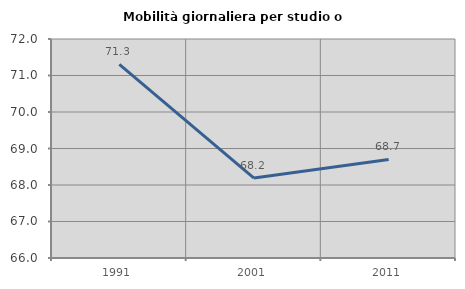
| Category | Mobilità giornaliera per studio o lavoro |
|---|---|
| 1991.0 | 71.306 |
| 2001.0 | 68.189 |
| 2011.0 | 68.701 |